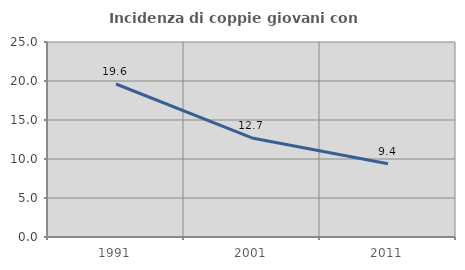
| Category | Incidenza di coppie giovani con figli |
|---|---|
| 1991.0 | 19.616 |
| 2001.0 | 12.7 |
| 2011.0 | 9.386 |